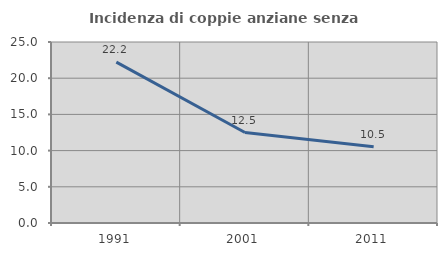
| Category | Incidenza di coppie anziane senza figli  |
|---|---|
| 1991.0 | 22.222 |
| 2001.0 | 12.5 |
| 2011.0 | 10.526 |